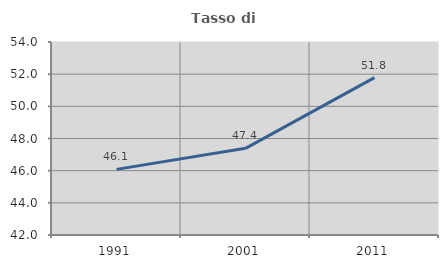
| Category | Tasso di occupazione   |
|---|---|
| 1991.0 | 46.08 |
| 2001.0 | 47.387 |
| 2011.0 | 51.789 |